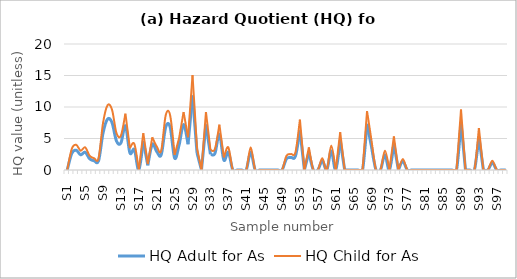
| Category | HQ Adult for As | HQ Child for As |
|---|---|---|
| S1 | 0 | 0 |
| S2 | 2.619 | 3.333 |
| S3 | 3.143 | 4 |
| S4 | 2.41 | 3.067 |
| S5 | 2.829 | 3.6 |
| S6 | 1.781 | 2.267 |
| S7 | 1.467 | 1.867 |
| S8 | 1.467 | 1.867 |
| S9 | 5.867 | 7.467 |
| S10 | 8.067 | 10.267 |
| S11 | 7.543 | 9.6 |
| S12 | 4.61 | 5.867 |
| S13 | 4.295 | 5.467 |
| S14 | 7.019 | 8.933 |
| S15 | 2.724 | 3.467 |
| S16 | 3.248 | 4.133 |
| S17 | 0 | 0 |
| S18 | 4.61 | 5.867 |
| S19 | 0.733 | 0.933 |
| S20 | 4.086 | 5.2 |
| S21 | 2.933 | 3.733 |
| S22 | 2.41 | 3.067 |
| S23 | 6.81 | 8.667 |
| S24 | 6.81 | 8.667 |
| S25 | 1.886 | 2.4 |
| S26 | 3.981 | 5.067 |
| S27 | 7.229 | 9.2 |
| S28 | 4.086 | 5.2 |
| S29 | 11.838 | 15.067 |
| S30 | 2.724 | 3.467 |
| S31 | 0 | 0 |
| S32 | 7.229 | 9.2 |
| S33 | 2.514 | 3.2 |
| S34 | 2.619 | 3.333 |
| S35 | 5.657 | 7.2 |
| S36 | 1.571 | 2 |
| S37 | 2.829 | 3.6 |
| S38 | 0 | 0 |
| S39 | 0 | 0 |
| S40 | 0 | 0 |
| S41 | 0 | 0 |
| S42 | 2.829 | 3.6 |
| S43 | 0 | 0 |
| S44 | 0 | 0 |
| S45 | 0 | 0 |
| S46 | 0 | 0 |
| S47 | 0 | 0 |
| S48 | 0 | 0 |
| S49 | 0 | 0 |
| S50 | 1.781 | 2.267 |
| S51 | 1.99 | 2.533 |
| S52 | 2.2 | 2.8 |
| S53 | 6.286 | 8 |
| S54 | 0 | 0 |
| S55 | 2.829 | 3.6 |
| S56 | 0 | 0 |
| S57 | 0 | 0 |
| S58 | 1.467 | 1.867 |
| S59 | 0 | 0 |
| S60 | 3.038 | 3.867 |
| S61 | 0 | 0 |
| S62 | 4.714 | 6 |
| S63 | 0 | 0 |
| S64 | 0 | 0 |
| S65 | 0 | 0 |
| S66 | 0 | 0 |
| S67 | 0 | 0 |
| S68 | 7.333 | 9.333 |
| S69 | 3.667 | 4.667 |
| S70 | 0 | 0 |
| S71 | 0 | 0 |
| S72 | 2.41 | 3.067 |
| S73 | 0 | 0 |
| S74 | 4.19 | 5.333 |
| S75 | 0 | 0 |
| S76 | 1.362 | 1.733 |
| S77 | 0 | 0 |
| S78 | 0 | 0 |
| S79 | 0 | 0 |
| S80 | 0 | 0 |
| S81 | 0 | 0 |
| S82 | 0 | 0 |
| S83 | 0 | 0 |
| S84 | 0 | 0 |
| S85 | 0 | 0 |
| S86 | 0 | 0 |
| S87 | 0 | 0 |
| S88 | 0 | 0 |
| S89 | 7.543 | 9.6 |
| S90 | 0 | 0 |
| S91 | 0 | 0 |
| S92 | 0 | 0 |
| S93 | 5.238 | 6.667 |
| S94 | 0 | 0 |
| S95 | 0 | 0 |
| S96 | 1.152 | 1.467 |
| S97 | 0 | 0 |
| S98 | 0 | 0 |
| S99 | 0 | 0 |